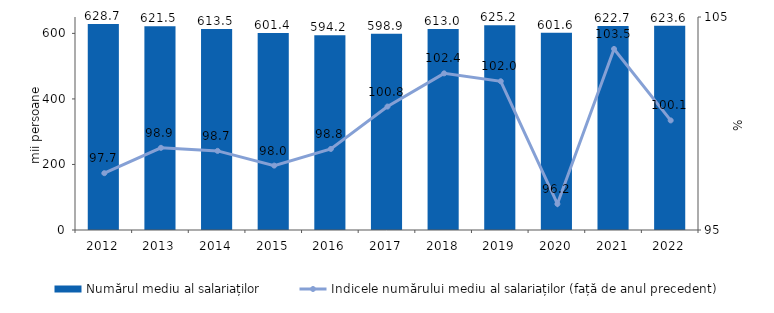
| Category | Numărul mediu al salariaților |
|---|---|
| 2012.0 | 628.695 |
| 2013.0 | 621.518 |
| 2014.0 | 613.526 |
| 2015.0 | 601.4 |
| 2016.0 | 594.219 |
| 2017.0 | 598.947 |
| 2018.0 | 613.048 |
| 2019.0 | 625.203 |
| 2020.0 | 601.597 |
| 2021.0 | 622.7 |
| 2022.0 | 623.6 |